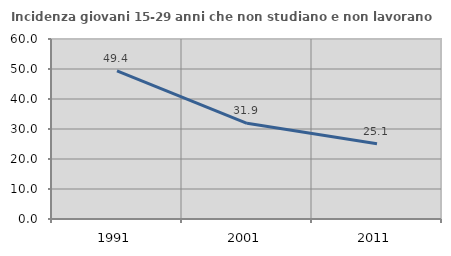
| Category | Incidenza giovani 15-29 anni che non studiano e non lavorano  |
|---|---|
| 1991.0 | 49.362 |
| 2001.0 | 31.9 |
| 2011.0 | 25.118 |